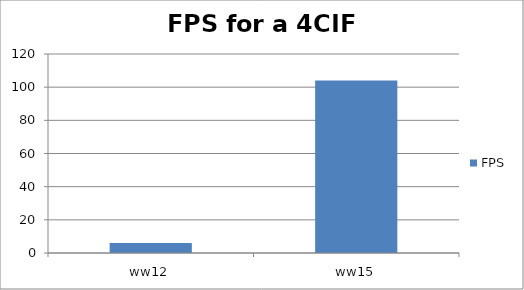
| Category | FPS |
|---|---|
| ww12 | 6 |
| ww15 | 104 |